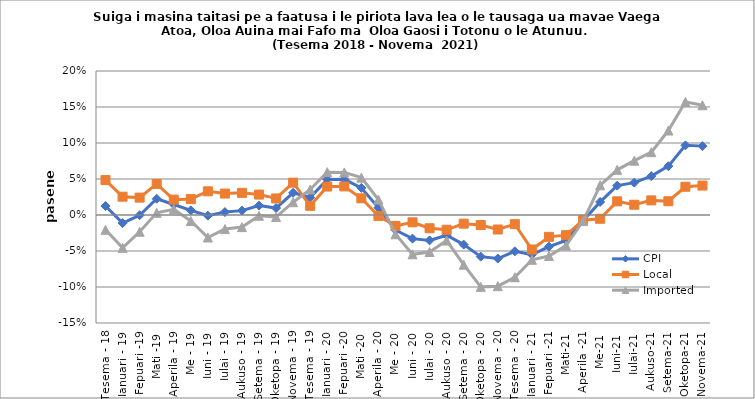
| Category | CPI | Local | Imported |
|---|---|---|---|
| Tesema - 18 | 0.012 | 0.049 | -0.021 |
| Ianuari - 19 | -0.011 | 0.025 | -0.046 |
| Fepuari -19 | 0 | 0.024 | -0.023 |
| Mati -19 | 0.023 | 0.043 | 0.003 |
| Aperila - 19 | 0.015 | 0.021 | 0.008 |
| Me - 19 | 0.006 | 0.022 | -0.008 |
| Iuni - 19 | -0.001 | 0.033 | -0.031 |
| Iulai - 19 | 0.004 | 0.03 | -0.02 |
| Aukuso - 19 | 0.006 | 0.031 | -0.017 |
| Setema - 19 | 0.013 | 0.028 | -0.001 |
| Oketopa - 19 | 0.01 | 0.023 | -0.003 |
| Novema - 19 | 0.031 | 0.045 | 0.018 |
| Tesema - 19 | 0.024 | 0.013 | 0.035 |
| Ianuari - 20 | 0.049 | 0.039 | 0.059 |
| Fepuari -20 | 0.05 | 0.04 | 0.059 |
| Mati -20 | 0.038 | 0.023 | 0.052 |
| Aperila - 20 | 0.01 | -0.001 | 0.021 |
| Me - 20 | -0.021 | -0.015 | -0.027 |
| Iuni - 20 | -0.033 | -0.01 | -0.055 |
| Iulai - 20 | -0.035 | -0.018 | -0.051 |
| Aukuso - 20 | -0.028 | -0.02 | -0.036 |
| Setema - 20 | -0.041 | -0.012 | -0.069 |
| Oketopa - 20 | -0.058 | -0.014 | -0.1 |
| Novema - 20 | -0.06 | -0.02 | -0.099 |
| Tesema - 20 | -0.05 | -0.013 | -0.086 |
| Ianuari - 21 | -0.055 | -0.048 | -0.062 |
| Fepuari -21 | -0.044 | -0.03 | -0.057 |
| Mati-21 | -0.035 | -0.028 | -0.043 |
| Aperila -21 | -0.008 | -0.007 | -0.008 |
| Me-21 | 0.018 | -0.005 | 0.041 |
| Iuni-21 | 0.041 | 0.019 | 0.063 |
| Iulai-21 | 0.045 | 0.014 | 0.075 |
| Aukuso-21 | 0.054 | 0.02 | 0.087 |
| Setema-21 | 0.068 | 0.019 | 0.117 |
| Oketopa-21 | 0.097 | 0.039 | 0.157 |
| Novema-21 | 0.096 | 0.041 | 0.152 |